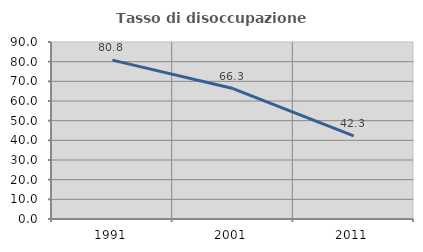
| Category | Tasso di disoccupazione giovanile  |
|---|---|
| 1991.0 | 80.804 |
| 2001.0 | 66.341 |
| 2011.0 | 42.258 |